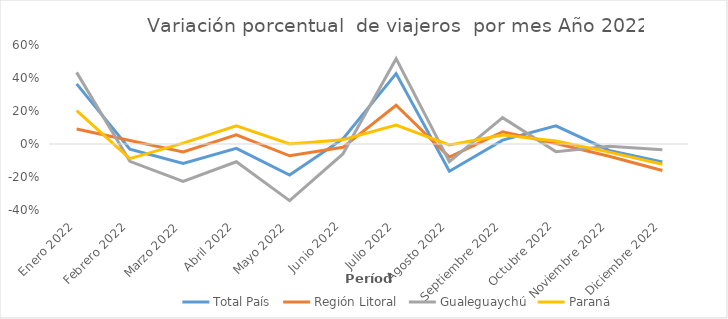
| Category | Total País | Región Litoral | Gualeguaychú | Paraná |
|---|---|---|---|---|
| Enero 2022 | 0.364 | 0.091 | 0.434 | 0.203 |
| Febrero 2022 | -0.031 | 0.022 | -0.105 | -0.089 |
| Marzo 2022 | -0.118 | -0.048 | -0.226 | 0.006 |
| Abril 2022 | -0.026 | 0.055 | -0.108 | 0.111 |
| Mayo 2022 | -0.188 | -0.072 | -0.344 | 0 |
| Junio 2022 | 0.031 | -0.02 | -0.06 | 0.026 |
| Julio 2022 | 0.427 | 0.235 | 0.517 | 0.115 |
| Agosto 2022 | -0.165 | -0.08 | -0.108 | -0.005 |
| Septiembre 2022 | 0.023 | 0.074 | 0.16 | 0.055 |
| Octubre 2022 | 0.11 | 0.003 | -0.046 | 0.018 |
| Noviembre 2022 | -0.039 | -0.075 | -0.013 | -0.049 |
| Diciembre 2022 | -0.109 | -0.161 | -0.035 | -0.122 |